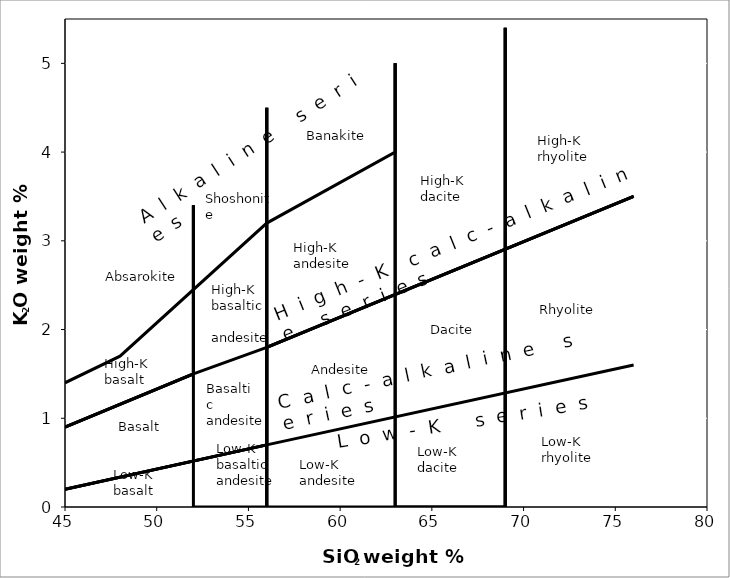
| Category | Series 3 |
|---|---|
| 45.0 | 1.4 |
| 48.0 | 1.7 |
| 56.0 | 3.2 |
| 63.0 | 4 |
| 63.0 | 5 |
| 63.0 | 0 |
| 69.0 | 0 |
| 69.0 | 5.4 |
| 69.0 | 0 |
| 56.0 | 0 |
| 56.0 | 4.5 |
| 56.0 | 0 |
| 52.0 | 0 |
| 52.0 | 3.4 |
| 52.0 | 1.5 |
| 45.0 | 0.9 |
| 52.0 | 1.5 |
| 56.0 | 1.8 |
| 76.0 | 3.5 |
| 56.0 | 1.8 |
| 56.0 | 0.7 |
| 45.0 | 0.2 |
| 56.0 | 0.7 |
| 76.0 | 1.6 |